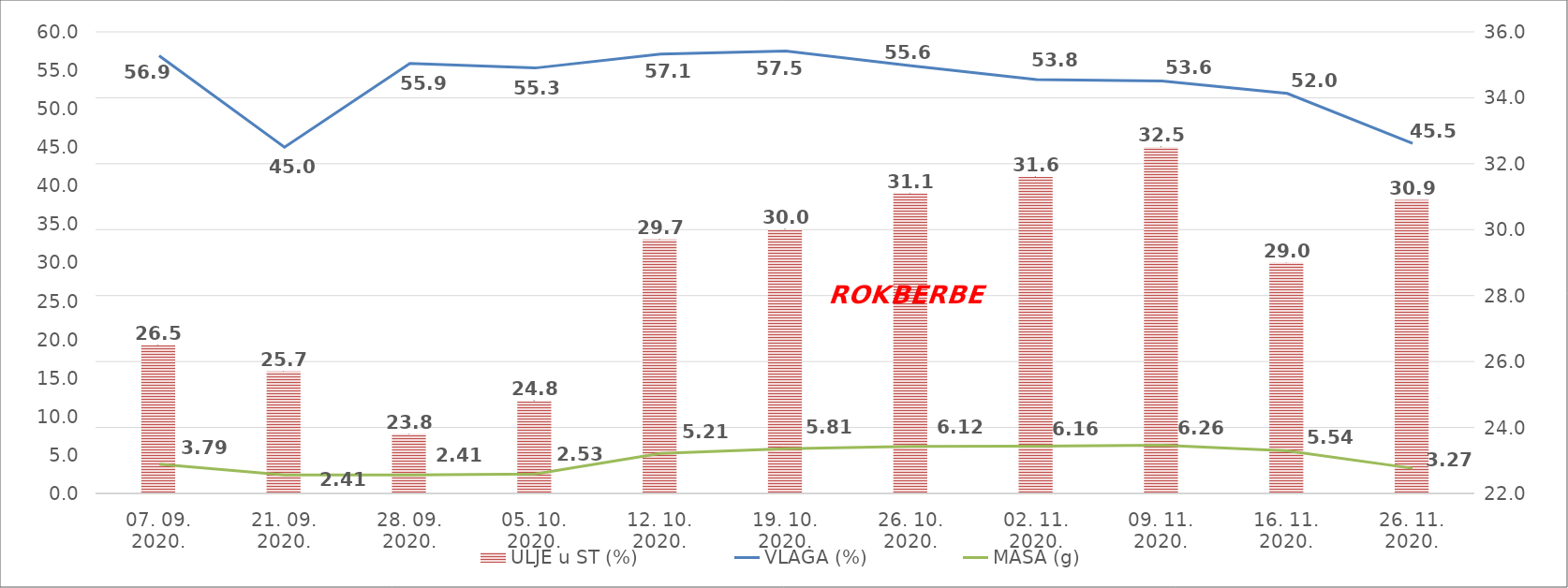
| Category | ULJE u ST (%) |
|---|---|
| 07. 09. 2020. | 26.5 |
| 21. 09. 2020. | 25.7 |
| 28. 09. 2020. | 23.8 |
| 05. 10. 2020. | 24.8 |
| 12. 10. 2020. | 29.7 |
| 19. 10. 2020. | 30 |
| 26. 10. 2020. | 31.1 |
| 02. 11. 2020. | 31.6 |
| 09. 11. 2020. | 32.5 |
| 16. 11. 2020. | 29 |
| 26. 11. 2020. | 30.9 |